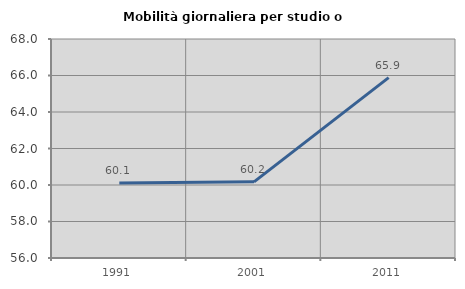
| Category | Mobilità giornaliera per studio o lavoro |
|---|---|
| 1991.0 | 60.108 |
| 2001.0 | 60.174 |
| 2011.0 | 65.884 |